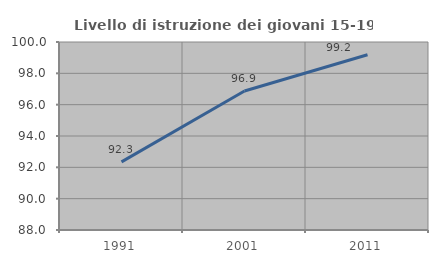
| Category | Livello di istruzione dei giovani 15-19 anni |
|---|---|
| 1991.0 | 92.35 |
| 2001.0 | 96.875 |
| 2011.0 | 99.187 |